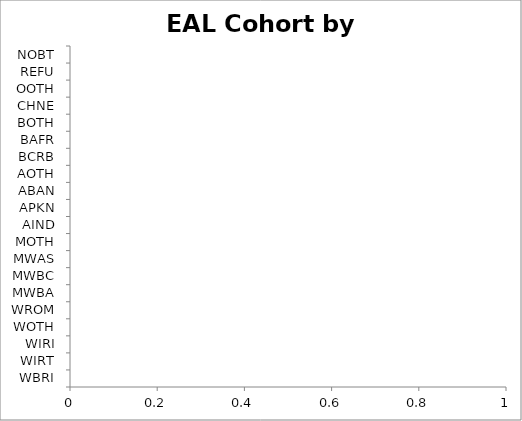
| Category | Series 0 |
|---|---|
| WBRI | 0 |
| WIRT | 0 |
| WIRI | 0 |
| WOTH | 0 |
| WROM | 0 |
| MWBA | 0 |
| MWBC | 0 |
| MWAS | 0 |
| MOTH | 0 |
| AIND | 0 |
| APKN | 0 |
| ABAN | 0 |
| AOTH | 0 |
| BCRB | 0 |
| BAFR | 0 |
| BOTH | 0 |
| CHNE | 0 |
| OOTH | 0 |
| REFU | 0 |
| NOBT | 0 |